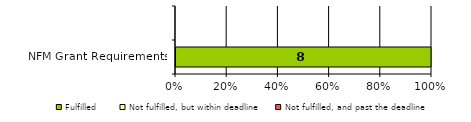
| Category | Fulfilled | Not fulfilled, but within deadline | Not fulfilled, and past the deadline |
|---|---|---|---|
| NFM Grant Requirements | 8 | 0 | 0 |